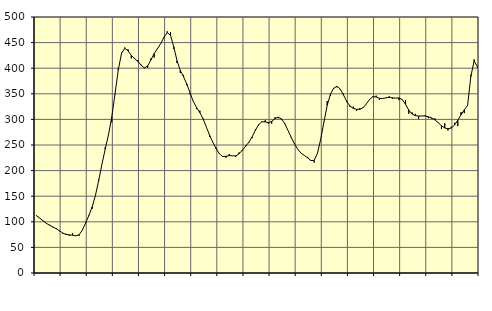
| Category | Piggar | Series 1 |
|---|---|---|
| nan | 112.6 | 111.55 |
| 87.0 | 106.8 | 107.05 |
| 87.0 | 101.5 | 101.86 |
| 87.0 | 96.1 | 96.95 |
| nan | 94.1 | 93.03 |
| 88.0 | 89.1 | 89.92 |
| 88.0 | 87.4 | 86.42 |
| 88.0 | 81.3 | 82.45 |
| nan | 76.8 | 78.13 |
| 89.0 | 76.6 | 75.27 |
| 89.0 | 72.8 | 74.58 |
| 89.0 | 77.5 | 73.81 |
| nan | 72.3 | 72.68 |
| 90.0 | 72.5 | 74.76 |
| 90.0 | 84.2 | 83.66 |
| 90.0 | 99.8 | 97.56 |
| nan | 113.4 | 112.34 |
| 91.0 | 125.5 | 128.88 |
| 91.0 | 150.9 | 151.23 |
| 91.0 | 182.5 | 180.39 |
| nan | 212.5 | 212.48 |
| 92.0 | 245.4 | 241.79 |
| 92.0 | 269.9 | 269.59 |
| 92.0 | 294.5 | 304.08 |
| nan | 348.5 | 349.37 |
| 93.0 | 400.9 | 396.15 |
| 93.0 | 430.1 | 428.76 |
| 93.0 | 440.4 | 439.11 |
| nan | 436.9 | 433.86 |
| 94.0 | 419.2 | 424.92 |
| 94.0 | 420 | 418.75 |
| 94.0 | 415.8 | 413.46 |
| nan | 406.9 | 405.74 |
| 95.0 | 399.9 | 400.56 |
| 95.0 | 400.6 | 404.35 |
| 95.0 | 418.9 | 416.03 |
| nan | 420.8 | 428.51 |
| 96.0 | 439.4 | 438.06 |
| 96.0 | 448 | 447.82 |
| 96.0 | 459.1 | 460.37 |
| nan | 472 | 469.51 |
| 97.0 | 470.4 | 464.2 |
| 97.0 | 437.6 | 441.94 |
| 97.0 | 410.1 | 414.73 |
| nan | 390.8 | 395.71 |
| 98.0 | 386.9 | 383.34 |
| 98.0 | 366.6 | 369.16 |
| 98.0 | 348.7 | 351.7 |
| nan | 335.1 | 334.78 |
| 99.0 | 320.2 | 323.13 |
| 99.0 | 317.1 | 313.22 |
| 99.0 | 301.7 | 300.85 |
| nan | 284.7 | 284.88 |
| 0.0 | 265.7 | 268.7 |
| 0.0 | 254.6 | 254.85 |
| 0.0 | 244.8 | 242.7 |
| nan | 232.9 | 232.53 |
| 1.0 | 226.8 | 227.51 |
| 1.0 | 225.2 | 227.99 |
| 1.0 | 232.4 | 229.37 |
| nan | 228.6 | 228.85 |
| 2.0 | 226.8 | 228.76 |
| 2.0 | 235.4 | 232.74 |
| 2.0 | 238.6 | 239.9 |
| nan | 248.9 | 247.36 |
| 3.0 | 254.2 | 255.31 |
| 3.0 | 263.4 | 265.8 |
| 3.0 | 281 | 278.67 |
| nan | 290.9 | 289.82 |
| 4.0 | 296.1 | 295.38 |
| 4.0 | 298.3 | 295.11 |
| 4.0 | 291.1 | 293.65 |
| nan | 292 | 296.16 |
| 5.0 | 304.2 | 301.51 |
| 5.0 | 302.2 | 304.41 |
| 5.0 | 299.8 | 301.09 |
| nan | 293 | 291.59 |
| 6.0 | 278.6 | 278.48 |
| 6.0 | 263.6 | 264.63 |
| 6.0 | 253.8 | 252.04 |
| nan | 241.1 | 241.46 |
| 7.0 | 234.2 | 234.05 |
| 7.0 | 229.3 | 229.76 |
| 7.0 | 226.8 | 225.03 |
| nan | 220.8 | 219.6 |
| 8.0 | 215.7 | 220.02 |
| 8.0 | 232.7 | 233.36 |
| 8.0 | 261 | 260.82 |
| nan | 295.4 | 294.67 |
| 9.0 | 335.9 | 327.29 |
| 9.0 | 346.1 | 349.31 |
| 9.0 | 359.4 | 361.2 |
| nan | 362.8 | 364.5 |
| 10.0 | 358.1 | 359.37 |
| 10.0 | 350.4 | 347.63 |
| 10.0 | 333.6 | 334.97 |
| nan | 324.4 | 326.01 |
| 11.0 | 324.9 | 321.44 |
| 11.0 | 316.6 | 319.78 |
| 11.0 | 322.3 | 319.66 |
| nan | 324 | 322.89 |
| 12.0 | 329.8 | 330.37 |
| 12.0 | 339.7 | 339.03 |
| 12.0 | 345.3 | 344.34 |
| nan | 346.4 | 343.78 |
| 13.0 | 338.1 | 341.04 |
| 13.0 | 340.8 | 340.73 |
| 13.0 | 341.8 | 342.22 |
| nan | 345.4 | 342.94 |
| 14.0 | 340.1 | 342.1 |
| 14.0 | 341.7 | 341.57 |
| 14.0 | 337.7 | 342.05 |
| nan | 339.3 | 338.68 |
| 15.0 | 337.8 | 329.34 |
| 15.0 | 311 | 318.06 |
| 15.0 | 313.7 | 310.37 |
| nan | 310.8 | 307.41 |
| 16.0 | 301.3 | 306.58 |
| 16.0 | 306.6 | 306.72 |
| 16.0 | 308 | 306.67 |
| nan | 302.4 | 305.15 |
| 17.0 | 301.5 | 302.87 |
| 17.0 | 302 | 299.05 |
| 17.0 | 294.6 | 293.5 |
| nan | 281.3 | 287.56 |
| 18.0 | 292.5 | 283.19 |
| 18.0 | 278.5 | 281.75 |
| 18.0 | 285.7 | 283.06 |
| nan | 293.3 | 288.82 |
| 19.0 | 286.9 | 298.46 |
| 19.0 | 314.3 | 308.75 |
| 19.0 | 312.3 | 318.77 |
| nan | 327.4 | 327.08 |
| 20.0 | 387 | 383.72 |
| 20.0 | 417.1 | 413.9 |
| 20.0 | 401.1 | 403.31 |